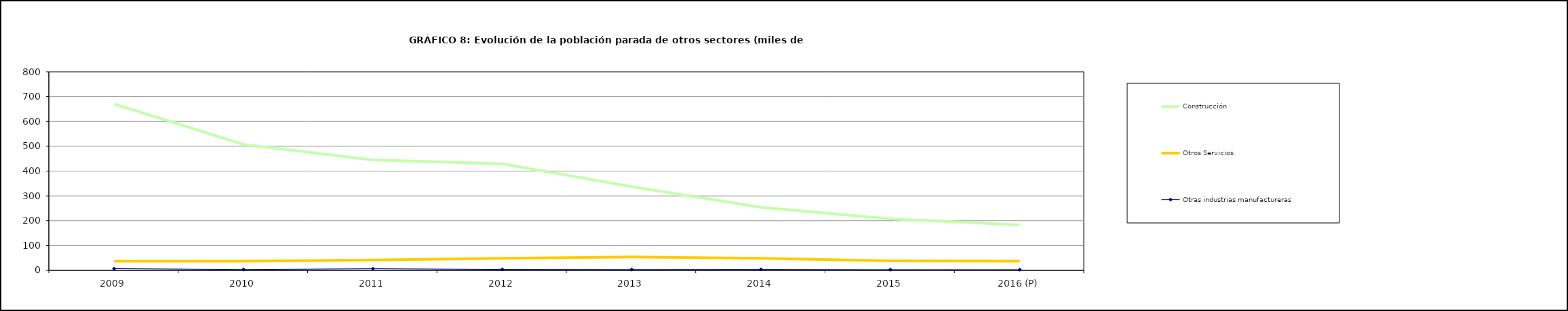
| Category | Construcción | Otros Servicios | Otras industrias manufactureras |
|---|---|---|---|
| 2009 | 670.55 | 37.15 | 6.875 |
| 2010 | 507.325 | 36.775 | 3.475 |
| 2011 | 445 | 41.375 | 6.55 |
| 2012 | 429.35 | 48.3 | 3.85 |
| 2013 | 337.3 | 53.6 | 3.3 |
| 2014 | 253.7 | 48.725 | 3.775 |
| 2015 | 207.3 | 38 | 2.9 |
| 2016 (P) | 182.7 | 36.7 | 2.8 |